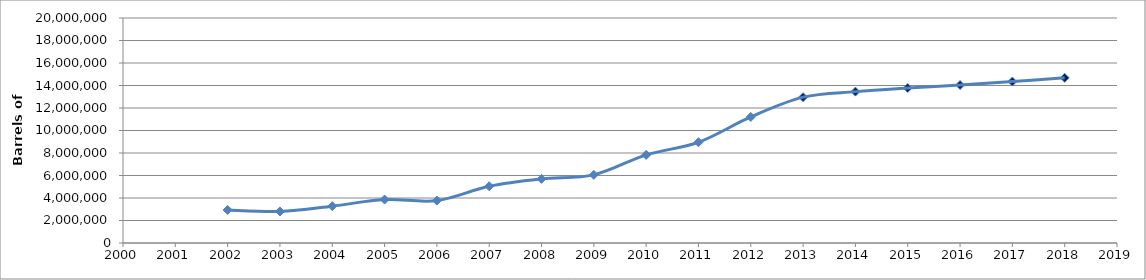
| Category | Series 0 |
|---|---|
| 2002.0 | 2940738 |
| 2003.0 | 2805745 |
| 2004.0 | 3276753 |
| 2005.0 | 3862726 |
| 2006.0 | 3768506 |
| 2007.0 | 5043578 |
| 2008.0 | 5699654 |
| 2009.0 | 6057583 |
| 2010.0 | 7830758 |
| 2011.0 | 8955798 |
| 2012.0 | 11204120 |
| 2013.0 | 12963166.84 |
| 2014.0 | 13455767.18 |
| 2015.0 | 13778705.592 |
| 2016.0 | 14040500.998 |
| 2017.0 | 14349392.02 |
| 2018.0 | 14679428.037 |